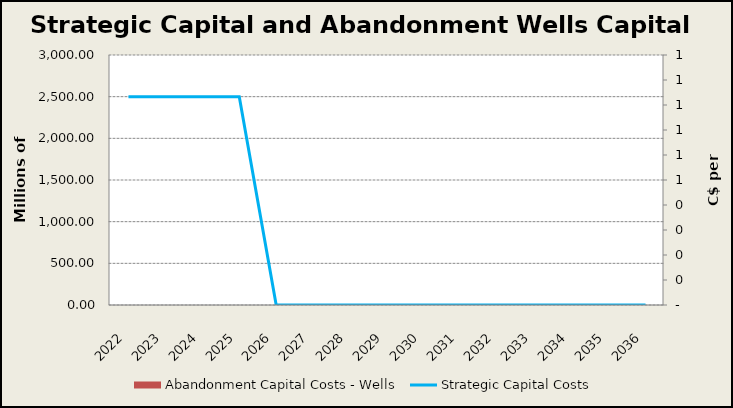
| Category | Abandonment Capital Costs - Wells |
|---|---|
| 2022.0 | 0 |
| 2023.0 | 0 |
| 2024.0 | 0 |
| 2025.0 | 0 |
| 2026.0 | 0 |
| 2027.0 | 0 |
| 2028.0 | 0 |
| 2029.0 | 0 |
| 2030.0 | 0 |
| 2031.0 | 0 |
| 2032.0 | 0 |
| 2033.0 | 0 |
| 2034.0 | 0 |
| 2035.0 | 0 |
| 2036.0 | 0 |